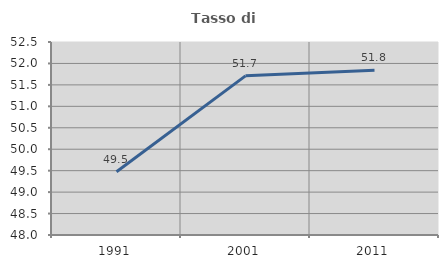
| Category | Tasso di occupazione   |
|---|---|
| 1991.0 | 49.473 |
| 2001.0 | 51.711 |
| 2011.0 | 51.844 |